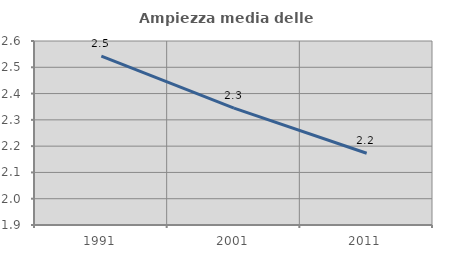
| Category | Ampiezza media delle famiglie |
|---|---|
| 1991.0 | 2.543 |
| 2001.0 | 2.345 |
| 2011.0 | 2.173 |